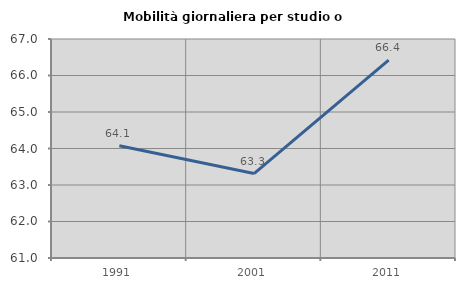
| Category | Mobilità giornaliera per studio o lavoro |
|---|---|
| 1991.0 | 64.076 |
| 2001.0 | 63.314 |
| 2011.0 | 66.422 |